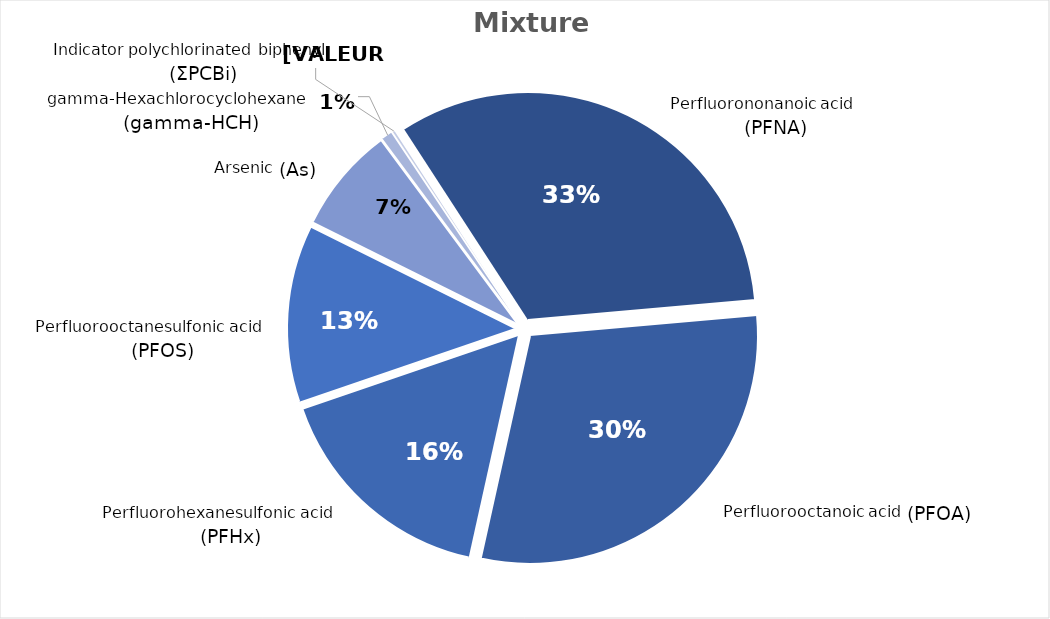
| Category | Series 0 |
|---|---|
| Perfluorononanoic acid (PFNA) | 0.328 |
| Perfluorooctanoic acid (PFOA) | 0.299 |
| Perfluorohexanesulfonic acid (PFHx) | 0.163 |
| Perfluorooctanesulfonic acid (PFOS) | 0.126 |
| Arsenic (As) | 0.075 |
| gamma-Hexachlorocyclohexane (gamma-HCH) | 0.008 |
| Indicator polychlorinated biphenyl (ΣPCBi) | 0.002 |